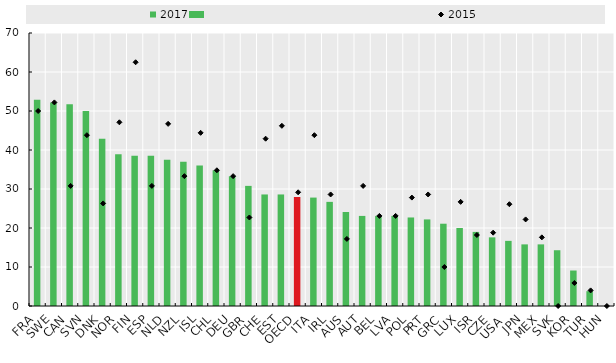
| Category | 2017 |
|---|---|
| FRA | 52.9 |
| SWE | 52.2 |
| CAN | 51.7 |
| SVN | 50 |
| DNK | 42.9 |
| NOR | 38.9 |
| FIN | 38.5 |
| ESP | 38.5 |
| NLD | 37.5 |
| NZL | 37 |
| ISL | 36 |
| CHL | 34.8 |
| DEU | 33.3 |
| GBR | 30.8 |
| CHE | 28.6 |
| EST | 28.6 |
| OECD | 27.949 |
| ITA | 27.8 |
| IRL | 26.7 |
| AUS | 24.1 |
| AUT | 23.1 |
| BEL | 23.1 |
| LVA | 23.1 |
| POL | 22.7 |
| PRT | 22.2 |
| GRC | 21.1 |
| LUX | 20 |
| ISR | 19 |
| CZE | 17.6 |
| USA  | 16.7 |
| JPN | 15.8 |
| MEX | 15.8 |
| SVK | 14.3 |
| KOR | 9.1 |
| TUR | 3.8 |
| HUN | 0 |